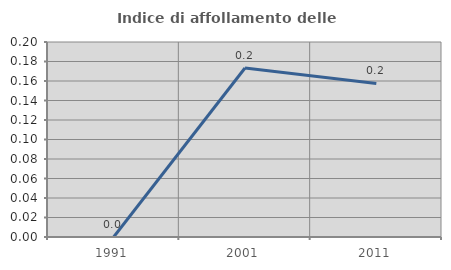
| Category | Indice di affollamento delle abitazioni  |
|---|---|
| 1991.0 | 0 |
| 2001.0 | 0.173 |
| 2011.0 | 0.157 |